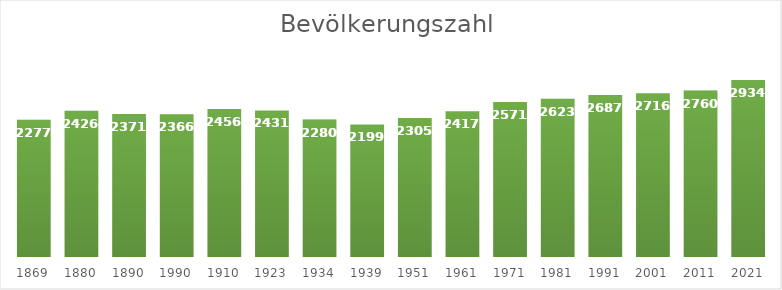
| Category | Bevölkerungszahl |
|---|---|
| 1869.0 | 2277 |
| 1880.0 | 2426 |
| 1890.0 | 2371 |
| 1990.0 | 2366 |
| 1910.0 | 2456 |
| 1923.0 | 2431 |
| 1934.0 | 2280 |
| 1939.0 | 2199 |
| 1951.0 | 2305 |
| 1961.0 | 2417 |
| 1971.0 | 2571 |
| 1981.0 | 2623 |
| 1991.0 | 2687 |
| 2001.0 | 2716 |
| 2011.0 | 2760 |
| 2021.0 | 2934 |